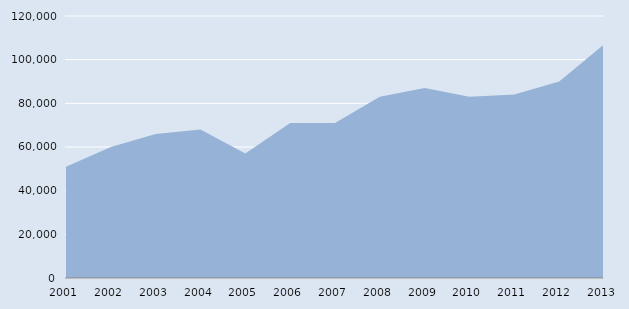
| Category | Series 0 |
|---|---|
| 2001.0 | 51000 |
| 2002.0 | 60000 |
| 2003.0 | 66000 |
| 2004.0 | 68000 |
| 2005.0 | 57000 |
| 2006.0 | 71000 |
| 2007.0 | 71000 |
| 2008.0 | 83000 |
| 2009.0 | 87000 |
| 2010.0 | 83000 |
| 2011.0 | 84000 |
| 2012.0 | 90000 |
| 2013.0 | 107000 |